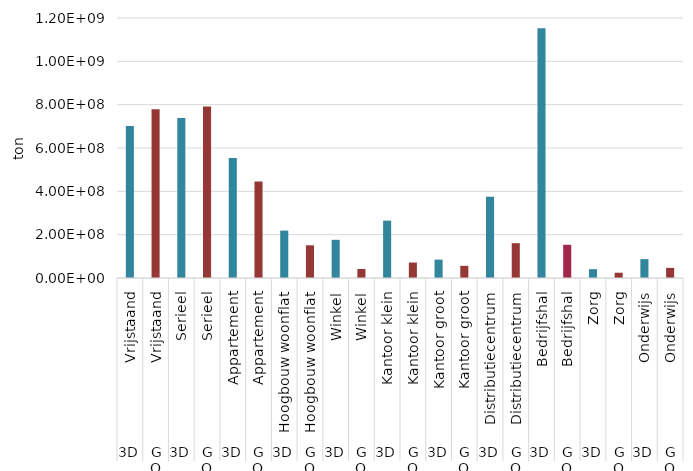
| Category | Series 0 |
|---|---|
| 0 | 701413036.182 |
| 1 | 779319938.29 |
| 2 | 738314240.324 |
| 3 | 791049042.642 |
| 4 | 553581578.848 |
| 5 | 445051164.152 |
| 6 | 218811701.955 |
| 7 | 150979061.712 |
| 8 | 176193940.495 |
| 9 | 41471463.683 |
| 10 | 264634776.605 |
| 11 | 71449916.703 |
| 12 | 84888073.778 |
| 13 | 56150748.771 |
| 14 | 375161895.46 |
| 15 | 160678430.802 |
| 16 | 1152707851.991 |
| 17 | 153294028.719 |
| 18 | 40751695.014 |
| 19 | 24311134.462 |
| 20 | 87221649.965 |
| 21 | 46699320.508 |